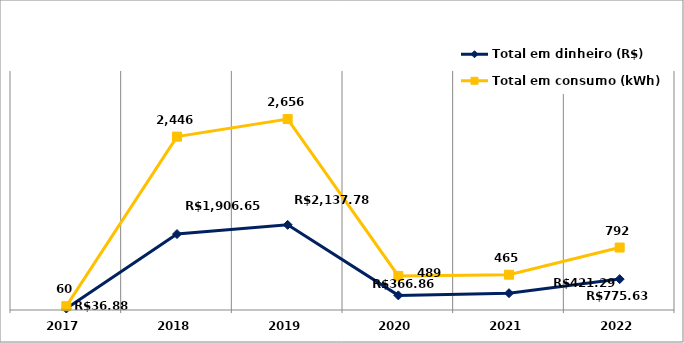
| Category | Total em dinheiro (R$) | Total em consumo (kWh) |
|---|---|---|
| 2017.0 | 36.88 | 60 |
| 2018.0 | 1906.65 | 2446 |
| 2019.0 | 2137.78 | 2656 |
| 2020.0 | 366.86 | 489 |
| 2021.0 | 421.29 | 465 |
| 2022.0 | 775.63 | 792 |